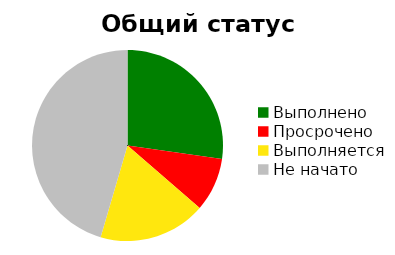
| Category | Series 0 |
|---|---|
| Выполнено | 0.273 |
| Просрочено | 0.091 |
| Выполняется | 0.182 |
| Не начато | 0.455 |